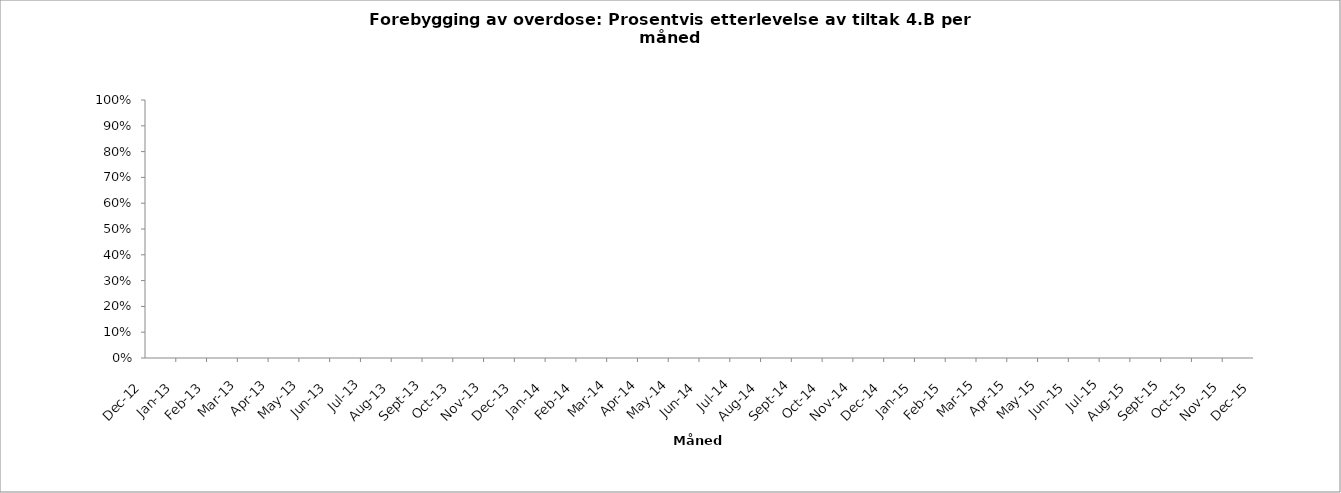
| Category | p_P6 | m_P6 |
|---|---|---|
| 2012-12-01 |  | 0 |
| 2013-01-01 |  | 0 |
| 2013-02-01 |  | 0 |
| 2013-03-01 |  | 0 |
| 2013-04-01 |  | 0 |
| 2013-05-01 |  | 0 |
| 2013-06-01 |  | 0 |
| 2013-07-01 |  | 0 |
| 2013-08-01 |  | 0 |
| 2013-09-01 |  | 0 |
| 2013-10-01 |  | 0 |
| 2013-11-01 |  | 0 |
| 2013-12-01 |  | 0 |
| 2014-01-01 |  | 0 |
| 2014-02-01 |  | 0 |
| 2014-03-01 |  | 0 |
| 2014-04-01 |  | 0 |
| 2014-05-01 |  | 0 |
| 2014-06-01 |  | 0 |
| 2014-07-01 |  | 0 |
| 2014-08-01 |  | 0 |
| 2014-09-01 |  | 0 |
| 2014-10-01 |  | 0 |
| 2014-11-01 |  | 0 |
| 2014-12-01 |  | 0 |
| 2015-01-01 |  | 0 |
| 2015-02-01 |  | 0 |
| 2015-03-01 |  | 0 |
| 2015-04-01 |  | 0 |
| 2015-05-01 |  | 0 |
| 2015-06-01 |  | 0 |
| 2015-07-01 |  | 0 |
| 2015-08-01 |  | 0 |
| 2015-09-01 |  | 0 |
| 2015-10-01 |  | 0 |
| 2015-11-01 |  | 0 |
| 2015-12-01 |  | 0 |